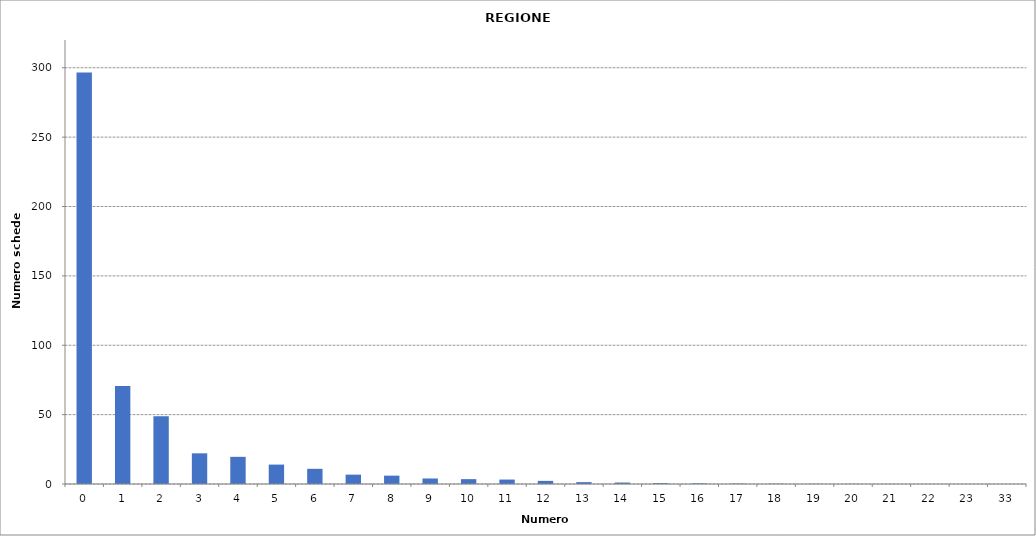
| Category | Series 0 |
|---|---|
| 0.0 | 296663 |
| 1.0 | 70641 |
| 2.0 | 48813 |
| 3.0 | 22109 |
| 4.0 | 19574 |
| 5.0 | 13982 |
| 6.0 | 10943 |
| 7.0 | 6747 |
| 8.0 | 6022 |
| 9.0 | 3978 |
| 10.0 | 3504 |
| 11.0 | 3198 |
| 12.0 | 2243 |
| 13.0 | 1349 |
| 14.0 | 1056 |
| 15.0 | 643 |
| 16.0 | 440 |
| 17.0 | 270 |
| 18.0 | 172 |
| 19.0 | 113 |
| 20.0 | 79 |
| 21.0 | 46 |
| 22.0 | 29 |
| 23.0 | 1 |
| 33.0 | 1 |